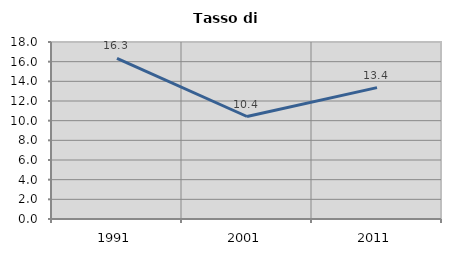
| Category | Tasso di disoccupazione   |
|---|---|
| 1991.0 | 16.341 |
| 2001.0 | 10.423 |
| 2011.0 | 13.36 |